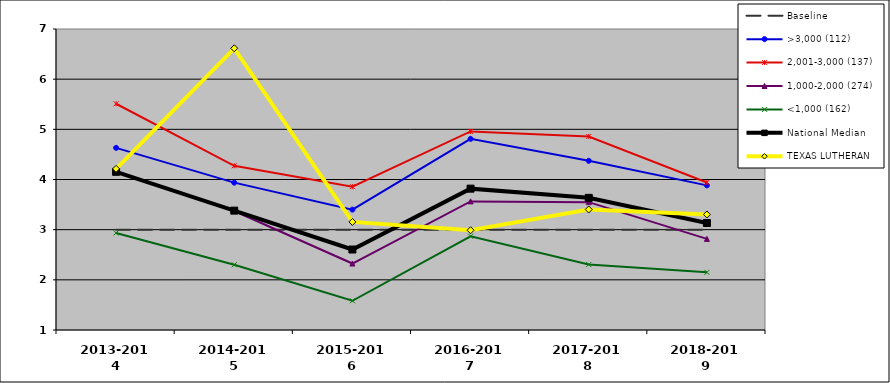
| Category | Baseline | >3,000 (112) | 2,001-3,000 (137) | 1,000-2,000 (274) | <1,000 (162) | National Median | TEXAS LUTHERAN |
|---|---|---|---|---|---|---|---|
| 2013-2014 | 3 | 4.631 | 5.51 | 4.165 | 2.935 | 4.153 | 4.212 |
| 2014-2015 | 3 | 3.937 | 4.273 | 3.372 | 2.301 | 3.379 | 6.615 |
| 2015-2016 | 3 | 3.4 | 3.857 | 2.325 | 1.583 | 2.604 | 3.155 |
| 2016-2017 | 3 | 4.81 | 4.957 | 3.564 | 2.869 | 3.818 | 2.989 |
| 2017-2018 | 3 | 4.373 | 4.857 | 3.549 | 2.306 | 3.634 | 3.403 |
| 2018-2019 | 3 | 3.883 | 3.941 | 2.816 | 2.149 | 3.133 | 3.303 |